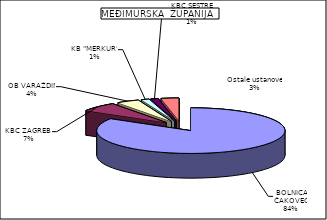
| Category | Series 0 |
|---|---|
| BOLNICA ČAKOVEC | 83.732 |
| KBC ZAGREB  | 6.635 |
| OB VARAŽDIN | 3.875 |
| KB "MERKUR" | 1.389 |
| KBC SESTRE MILOSRDNICE | 1.305 |
| Ostale ustanove | 3.063 |